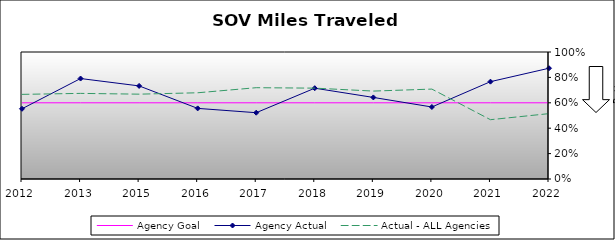
| Category | Agency Goal | Agency Actual | Actual - ALL Agencies |
|---|---|---|---|
| 2012.0 | 0.6 | 0.553 | 0.666 |
| 2013.0 | 0.6 | 0.791 | 0.674 |
| 2015.0 | 0.6 | 0.733 | 0.668 |
| 2016.0 | 0.6 | 0.556 | 0.679 |
| 2017.0 | 0.6 | 0.522 | 0.719 |
| 2018.0 | 0.6 | 0.715 | 0.715 |
| 2019.0 | 0.6 | 0.642 | 0.692 |
| 2020.0 | 0.6 | 0.567 | 0.708 |
| 2021.0 | 0.6 | 0.766 | 0.467 |
| 2022.0 | 0.6 | 0.872 | 0.515 |